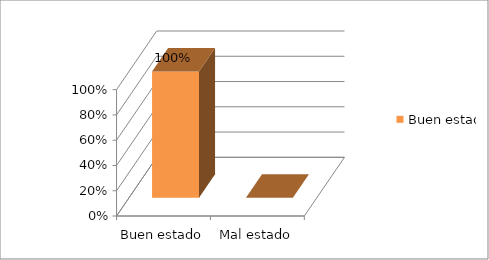
| Category | Buen estado |
|---|---|
| Buen estado | 1 |
| Mal estado | 0 |